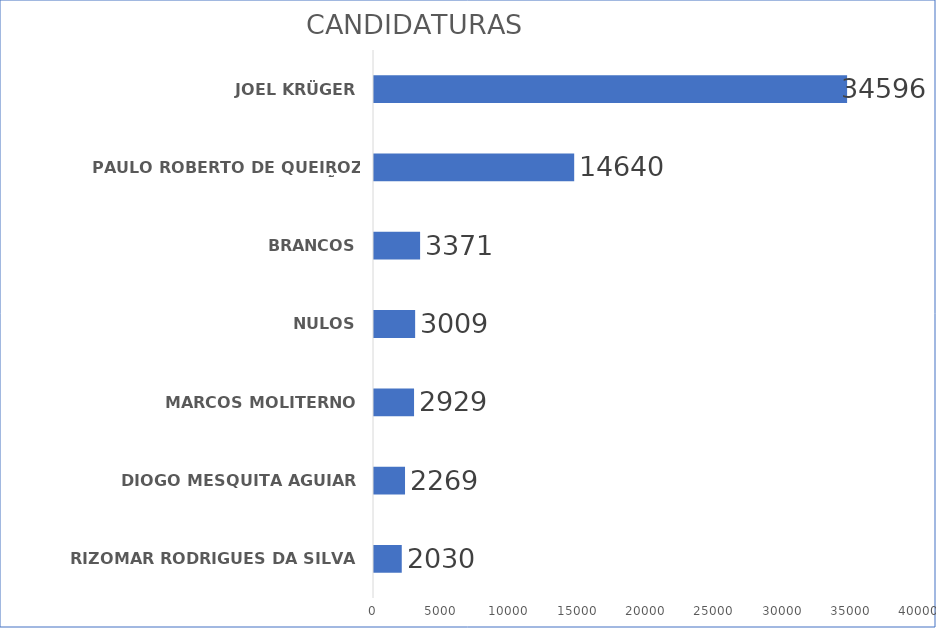
| Category | Total |
|---|---|
| RIZOMAR RODRIGUES DA SILVA | 2030 |
| DIOGO MESQUITA AGUIAR | 2269 |
| MARCOS MOLITERNO | 2929 |
| NULOS | 3009 |
| BRANCOS | 3371 |
| PAULO ROBERTO DE QUEIROZ GUIMARÃES | 14640 |
| JOEL KRÜGER | 34596 |